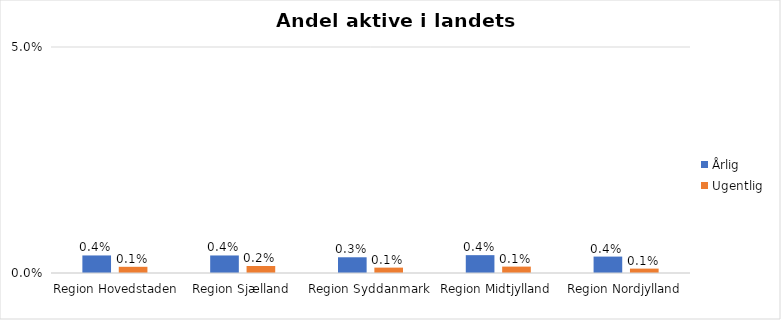
| Category | Årlig | Ugentlig |
|---|---|---|
| Region Hovedstaden | 0.004 | 0.001 |
| Region Sjælland | 0.004 | 0.002 |
| Region Syddanmark | 0.003 | 0.001 |
| Region Midtjylland | 0.004 | 0.001 |
| Region Nordjylland | 0.004 | 0.001 |